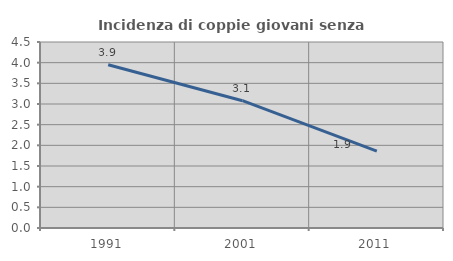
| Category | Incidenza di coppie giovani senza figli |
|---|---|
| 1991.0 | 3.949 |
| 2001.0 | 3.08 |
| 2011.0 | 1.858 |